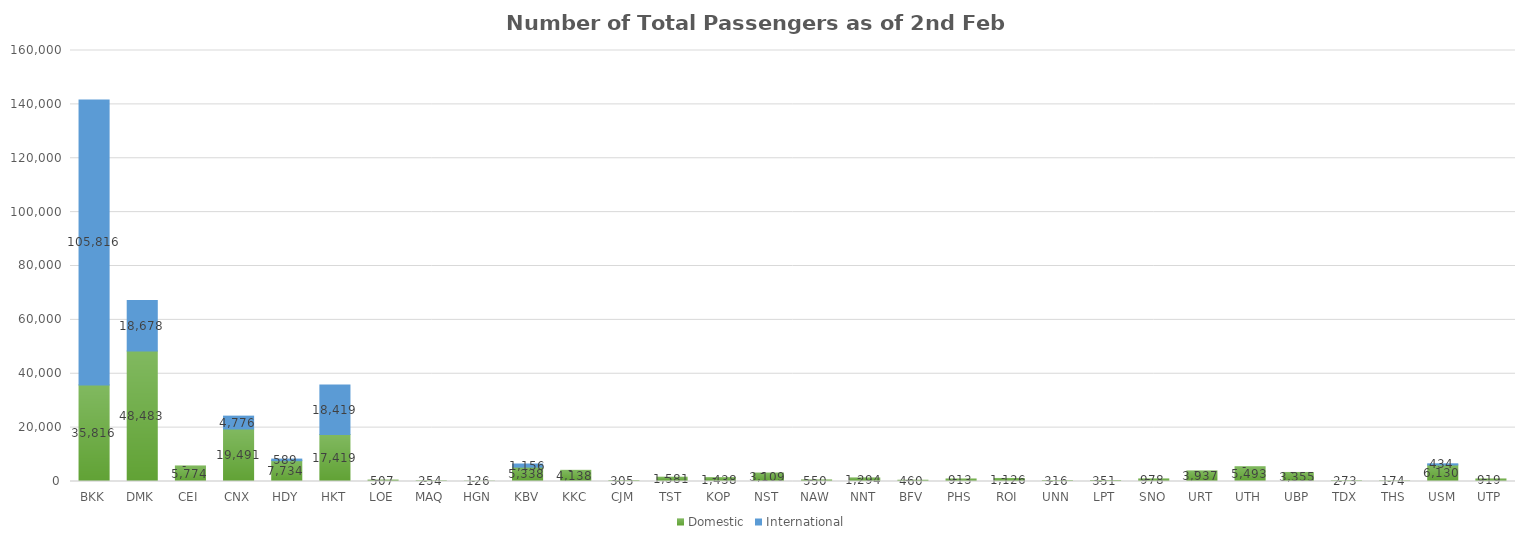
| Category | Domestic | International |
|---|---|---|
| BKK | 35816 | 105816 |
| DMK | 48483 | 18678 |
| CEI | 5774 | 0 |
| CNX | 19491 | 4776 |
| HDY | 7734 | 589 |
| HKT | 17419 | 18419 |
| LOE | 507 | 0 |
| MAQ | 254 | 0 |
| HGN | 126 | 0 |
| KBV | 5338 | 1156 |
| KKC | 4138 | 0 |
| CJM | 305 | 0 |
| TST | 1581 | 0 |
| KOP | 1438 | 0 |
| NST | 3109 | 0 |
| NAW | 550 | 0 |
| NNT | 1294 | 0 |
| BFV | 460 | 0 |
| PHS | 913 | 0 |
| ROI | 1126 | 0 |
| UNN | 316 | 0 |
| LPT | 351 | 0 |
| SNO | 978 | 0 |
| URT | 3937 | 0 |
| UTH | 5493 | 0 |
| UBP | 3355 | 0 |
| TDX | 273 | 0 |
| THS | 174 | 0 |
| USM | 6130 | 434 |
| UTP | 919 | 0 |